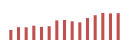
| Category | Importações (2) |
|---|---|
| 0 | 63256.661 |
| 1 | 80362.628 |
| 2 | 79098.748 |
| 3 | 89493.365 |
| 4 | 81914.569 |
| 5 | 86371.3 |
| 6 | 122399.001 |
| 7 | 125153.991 |
| 8 | 116754.909 |
| 9 | 110190.536 |
| 10 | 137205.926 |
| 11 | 154727.051 |
| 12 | 169208.338 |
| 13 | 166254.713 |
| 14 | 167736.792 |